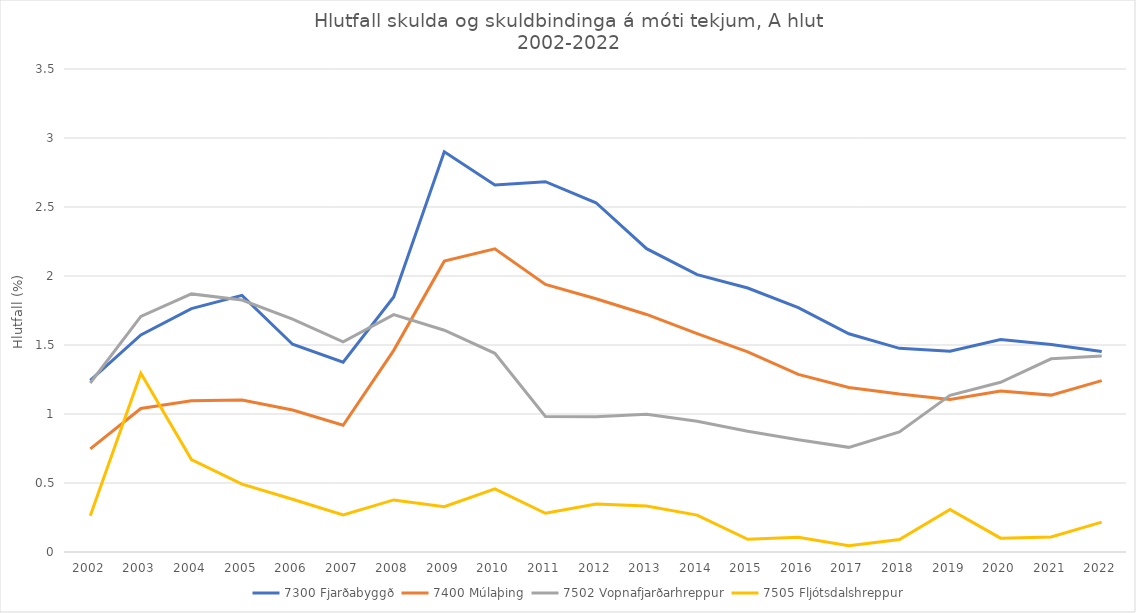
| Category | 7300 Fjarðabyggð | 7400 Múlaþing | 7502 Vopnafjarðarhreppur | 7505 Fljótsdalshreppur |
|---|---|---|---|---|
| 2002.0 | 1.244 | 0.747 | 1.225 | 0.263 |
| 2003.0 | 1.573 | 1.04 | 1.707 | 1.295 |
| 2004.0 | 1.764 | 1.095 | 1.87 | 0.67 |
| 2005.0 | 1.86 | 1.101 | 1.826 | 0.492 |
| 2006.0 | 1.505 | 1.029 | 1.687 | 0.383 |
| 2007.0 | 1.375 | 0.919 | 1.523 | 0.269 |
| 2008.0 | 1.848 | 1.461 | 1.72 | 0.377 |
| 2009.0 | 2.901 | 2.108 | 1.607 | 0.328 |
| 2010.0 | 2.66 | 2.197 | 1.44 | 0.457 |
| 2011.0 | 2.683 | 1.939 | 0.982 | 0.281 |
| 2012.0 | 2.531 | 1.835 | 0.981 | 0.348 |
| 2013.0 | 2.198 | 1.721 | 0.997 | 0.334 |
| 2014.0 | 2.01 | 1.582 | 0.948 | 0.268 |
| 2015.0 | 1.913 | 1.45 | 0.876 | 0.092 |
| 2016.0 | 1.771 | 1.287 | 0.814 | 0.106 |
| 2017.0 | 1.581 | 1.193 | 0.758 | 0.045 |
| 2018.0 | 1.476 | 1.144 | 0.87 | 0.09 |
| 2019.0 | 1.454 | 1.105 | 1.136 | 0.308 |
| 2020.0 | 1.54 | 1.166 | 1.23 | 0.1 |
| 2021.0 | 1.503 | 1.137 | 1.4 | 0.109 |
| 2022.0 | 1.453 | 1.242 | 1.421 | 0.216 |